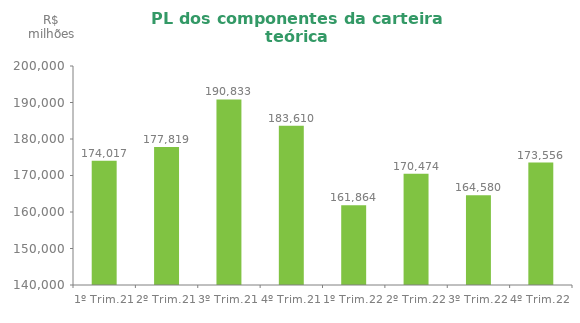
| Category | Series 0 |
|---|---|
| 1º Trim.21 | 174016.57 |
| 2º Trim.21 | 177819.2 |
| 3º Trim.21 | 190833.2 |
| 4º Trim.21 | 183610.486 |
| 1º Trim.22 | 161864.31 |
| 2º Trim.22 | 170474.192 |
| 3º Trim.22 | 164580 |
| 4º Trim.22 | 173556 |